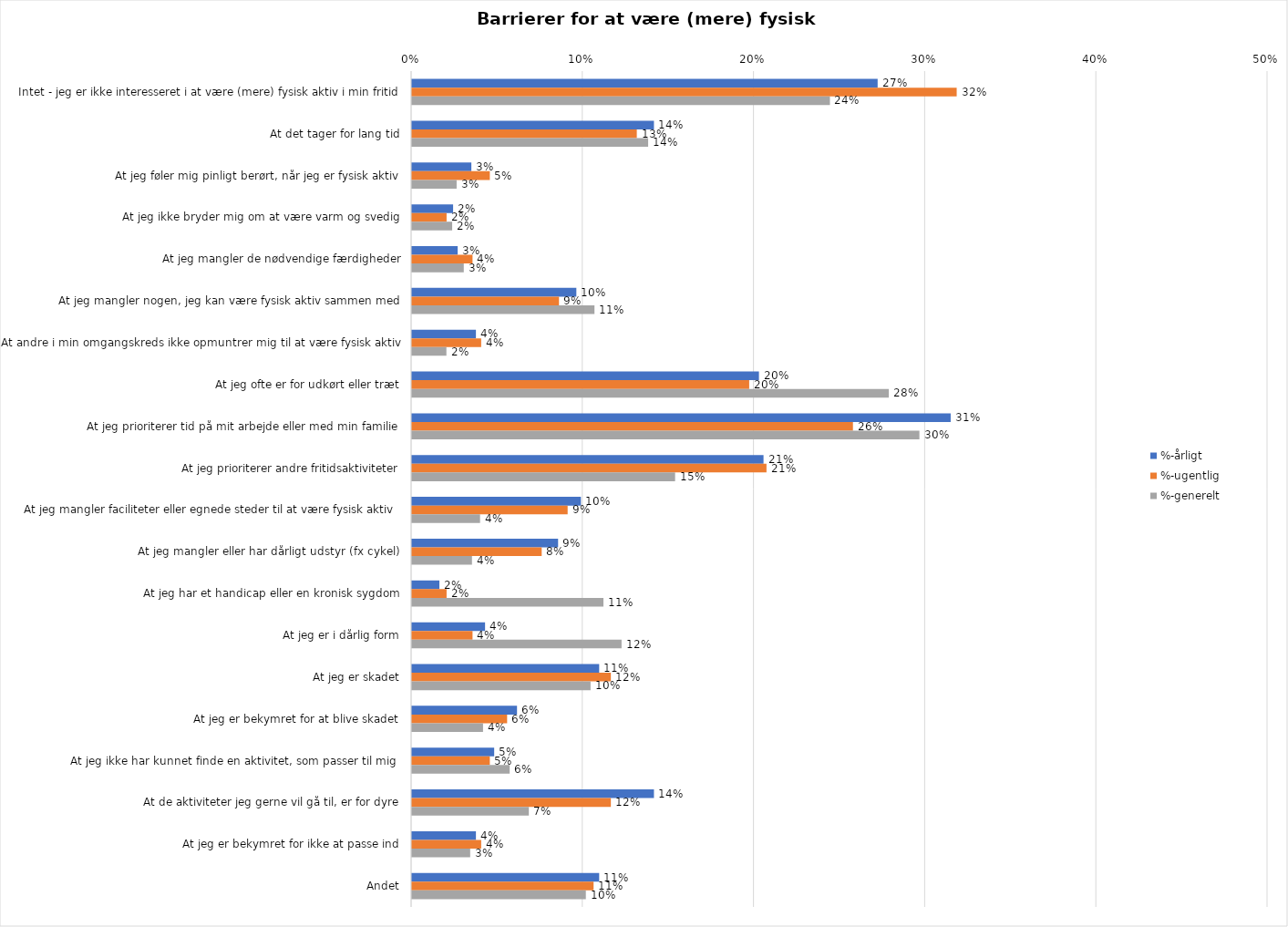
| Category | %-årligt | %-ugentlig | %-generelt |
|---|---|---|---|
| Intet - jeg er ikke interesseret i at være (mere) fysisk aktiv i min fritid | 0.272 | 0.318 | 0.244 |
| At det tager for lang tid | 0.141 | 0.131 | 0.138 |
| At jeg føler mig pinligt berørt, når jeg er fysisk aktiv | 0.035 | 0.045 | 0.026 |
| At jeg ikke bryder mig om at være varm og svedig | 0.024 | 0.02 | 0.023 |
| At jeg mangler de nødvendige færdigheder | 0.027 | 0.035 | 0.03 |
| At jeg mangler nogen, jeg kan være fysisk aktiv sammen med | 0.096 | 0.086 | 0.107 |
| At andre i min omgangskreds ikke opmuntrer mig til at være fysisk aktiv | 0.037 | 0.04 | 0.02 |
| At jeg ofte er for udkørt eller træt | 0.203 | 0.197 | 0.279 |
| At jeg prioriterer tid på mit arbejde eller med min familie | 0.315 | 0.258 | 0.296 |
| At jeg prioriterer andre fritidsaktiviteter | 0.205 | 0.207 | 0.154 |
| At jeg mangler faciliteter eller egnede steder til at være fysisk aktiv  | 0.099 | 0.091 | 0.04 |
| At jeg mangler eller har dårligt udstyr (fx cykel) | 0.085 | 0.076 | 0.035 |
| At jeg har et handicap eller en kronisk sygdom | 0.016 | 0.02 | 0.112 |
| At jeg er i dårlig form | 0.043 | 0.035 | 0.122 |
| At jeg er skadet | 0.109 | 0.116 | 0.104 |
| At jeg er bekymret for at blive skadet | 0.061 | 0.056 | 0.041 |
| At jeg ikke har kunnet finde en aktivitet, som passer til mig  | 0.048 | 0.045 | 0.057 |
| At de aktiviteter jeg gerne vil gå til, er for dyre | 0.141 | 0.116 | 0.068 |
| At jeg er bekymret for ikke at passe ind | 0.037 | 0.04 | 0.034 |
| Andet | 0.109 | 0.106 | 0.102 |